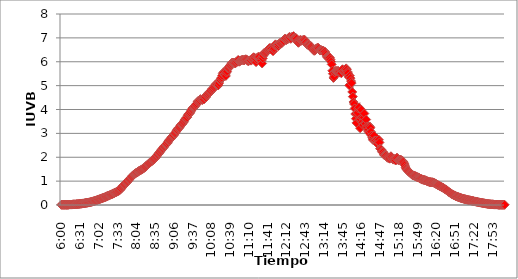
| Category | IUV (01/5) |
|---|---|
| 0.25 | 0.009 |
| 0.25069444444444444 | 0.009 |
| 0.2513888888888889 | 0.009 |
| 0.2520833333333333 | 0.009 |
| 0.25277777777777777 | 0.009 |
| 0.2534722222222222 | 0.009 |
| 0.25416666666666665 | 0.009 |
| 0.2548611111111111 | 0.009 |
| 0.2555555555555556 | 0.009 |
| 0.25625000000000003 | 0.009 |
| 0.2569444444444445 | 0.009 |
| 0.2576388888888889 | 0.009 |
| 0.25833333333333336 | 0.009 |
| 0.2590277777777778 | 0.019 |
| 0.25972222222222224 | 0.019 |
| 0.2604166666666667 | 0.019 |
| 0.2611111111111111 | 0.019 |
| 0.26180555555555557 | 0.019 |
| 0.2625 | 0.019 |
| 0.26319444444444445 | 0.028 |
| 0.2638888888888889 | 0.028 |
| 0.26458333333333334 | 0.028 |
| 0.2652777777777778 | 0.028 |
| 0.2659722222222222 | 0.028 |
| 0.26666666666666666 | 0.028 |
| 0.2673611111111111 | 0.037 |
| 0.26805555555555555 | 0.037 |
| 0.26875 | 0.037 |
| 0.26944444444444443 | 0.037 |
| 0.2701388888888889 | 0.047 |
| 0.2708333333333333 | 0.047 |
| 0.27152777777777776 | 0.047 |
| 0.2722222222222222 | 0.056 |
| 0.27291666666666664 | 0.056 |
| 0.2736111111111111 | 0.056 |
| 0.2743055555555555 | 0.065 |
| 0.27499999999999997 | 0.065 |
| 0.27569444444444446 | 0.065 |
| 0.27638888888888885 | 0.075 |
| 0.27708333333333335 | 0.075 |
| 0.2777777777777778 | 0.084 |
| 0.27847222222222223 | 0.084 |
| 0.2791666666666667 | 0.093 |
| 0.2798611111111111 | 0.093 |
| 0.28055555555555556 | 0.103 |
| 0.28125 | 0.103 |
| 0.28194444444444444 | 0.112 |
| 0.2826388888888889 | 0.112 |
| 0.2833333333333333 | 0.121 |
| 0.28402777777777777 | 0.13 |
| 0.2847222222222222 | 0.13 |
| 0.28541666666666665 | 0.14 |
| 0.28611111111111115 | 0.149 |
| 0.28680555555555554 | 0.158 |
| 0.28750000000000003 | 0.158 |
| 0.2881944444444445 | 0.168 |
| 0.2888888888888889 | 0.177 |
| 0.28958333333333336 | 0.186 |
| 0.2902777777777778 | 0.196 |
| 0.29097222222222224 | 0.205 |
| 0.2916666666666667 | 0.214 |
| 0.2923611111111111 | 0.224 |
| 0.29305555555555557 | 0.233 |
| 0.29375 | 0.242 |
| 0.29444444444444445 | 0.252 |
| 0.2951388888888889 | 0.261 |
| 0.29583333333333334 | 0.27 |
| 0.2965277777777778 | 0.28 |
| 0.2972222222222222 | 0.289 |
| 0.29791666666666666 | 0.298 |
| 0.2986111111111111 | 0.308 |
| 0.29930555555555555 | 0.317 |
| 0.3 | 0.326 |
| 0.30069444444444443 | 0.336 |
| 0.3013888888888889 | 0.345 |
| 0.3020833333333333 | 0.363 |
| 0.30277777777777776 | 0.373 |
| 0.3034722222222222 | 0.382 |
| 0.30416666666666664 | 0.391 |
| 0.3048611111111111 | 0.401 |
| 0.3055555555555555 | 0.41 |
| 0.30624999999999997 | 0.429 |
| 0.3069444444444444 | 0.438 |
| 0.3076388888888889 | 0.447 |
| 0.30833333333333335 | 0.457 |
| 0.3090277777777778 | 0.466 |
| 0.30972222222222223 | 0.485 |
| 0.3104166666666667 | 0.494 |
| 0.3111111111111111 | 0.503 |
| 0.31180555555555556 | 0.522 |
| 0.3125 | 0.531 |
| 0.31319444444444444 | 0.541 |
| 0.3138888888888889 | 0.559 |
| 0.3145833333333333 | 0.569 |
| 0.31527777777777777 | 0.587 |
| 0.3159722222222222 | 0.596 |
| 0.31666666666666665 | 0.615 |
| 0.31736111111111115 | 0.634 |
| 0.31805555555555554 | 0.662 |
| 0.31875000000000003 | 0.69 |
| 0.3194444444444445 | 0.736 |
| 0.3201388888888889 | 0.774 |
| 0.32083333333333336 | 0.802 |
| 0.3215277777777778 | 0.82 |
| 0.32222222222222224 | 0.848 |
| 0.3229166666666667 | 0.876 |
| 0.3236111111111111 | 0.904 |
| 0.32430555555555557 | 0.932 |
| 0.325 | 0.951 |
| 0.32569444444444445 | 0.979 |
| 0.3263888888888889 | 1.007 |
| 0.32708333333333334 | 1.035 |
| 0.3277777777777778 | 1.062 |
| 0.3284722222222222 | 1.09 |
| 0.32916666666666666 | 1.118 |
| 0.3298611111111111 | 1.146 |
| 0.33055555555555555 | 1.174 |
| 0.33125 | 1.202 |
| 0.33194444444444443 | 1.23 |
| 0.3326388888888889 | 1.249 |
| 0.3333333333333333 | 1.277 |
| 0.3340277777777778 | 1.295 |
| 0.3347222222222222 | 1.314 |
| 0.3354166666666667 | 1.333 |
| 0.3361111111111111 | 1.351 |
| 0.3368055555555556 | 1.361 |
| 0.33749999999999997 | 1.37 |
| 0.33819444444444446 | 1.398 |
| 0.33888888888888885 | 1.417 |
| 0.33958333333333335 | 1.435 |
| 0.34027777777777773 | 1.445 |
| 0.34097222222222223 | 1.454 |
| 0.3416666666666666 | 1.473 |
| 0.3423611111111111 | 1.491 |
| 0.3430555555555555 | 1.501 |
| 0.34375 | 1.519 |
| 0.3444444444444445 | 1.538 |
| 0.3451388888888889 | 1.556 |
| 0.3458333333333334 | 1.575 |
| 0.34652777777777777 | 1.603 |
| 0.34722222222222227 | 1.631 |
| 0.34791666666666665 | 1.65 |
| 0.34861111111111115 | 1.668 |
| 0.34930555555555554 | 1.696 |
| 0.35000000000000003 | 1.715 |
| 0.3506944444444444 | 1.743 |
| 0.3513888888888889 | 1.771 |
| 0.3520833333333333 | 1.789 |
| 0.3527777777777778 | 1.808 |
| 0.3534722222222222 | 1.827 |
| 0.3541666666666667 | 1.845 |
| 0.3548611111111111 | 1.873 |
| 0.35555555555555557 | 1.892 |
| 0.35625 | 1.92 |
| 0.35694444444444445 | 1.939 |
| 0.3576388888888889 | 1.967 |
| 0.35833333333333334 | 1.994 |
| 0.3590277777777778 | 2.032 |
| 0.3597222222222222 | 2.06 |
| 0.36041666666666666 | 2.097 |
| 0.3611111111111111 | 2.125 |
| 0.36180555555555555 | 2.162 |
| 0.3625 | 2.19 |
| 0.36319444444444443 | 2.218 |
| 0.3638888888888889 | 2.255 |
| 0.3645833333333333 | 2.293 |
| 0.3652777777777778 | 2.321 |
| 0.3659722222222222 | 2.349 |
| 0.3666666666666667 | 2.377 |
| 0.3673611111111111 | 2.414 |
| 0.3680555555555556 | 2.442 |
| 0.36874999999999997 | 2.479 |
| 0.36944444444444446 | 2.507 |
| 0.37013888888888885 | 2.535 |
| 0.37083333333333335 | 2.554 |
| 0.37152777777777773 | 2.582 |
| 0.37222222222222223 | 2.628 |
| 0.3729166666666666 | 2.675 |
| 0.3736111111111111 | 2.703 |
| 0.3743055555555555 | 2.731 |
| 0.375 | 2.759 |
| 0.3756944444444445 | 2.777 |
| 0.3763888888888889 | 2.824 |
| 0.3770833333333334 | 2.852 |
| 0.37777777777777777 | 2.88 |
| 0.37847222222222227 | 2.908 |
| 0.37916666666666665 | 2.926 |
| 0.37986111111111115 | 2.982 |
| 0.38055555555555554 | 2.992 |
| 0.38125000000000003 | 3.029 |
| 0.3819444444444444 | 3.094 |
| 0.3826388888888889 | 3.132 |
| 0.3833333333333333 | 3.15 |
| 0.3840277777777778 | 3.197 |
| 0.3847222222222222 | 3.234 |
| 0.3854166666666667 | 3.234 |
| 0.3861111111111111 | 3.271 |
| 0.38680555555555557 | 3.327 |
| 0.3875 | 3.374 |
| 0.38819444444444445 | 3.383 |
| 0.3888888888888889 | 3.402 |
| 0.38958333333333334 | 3.439 |
| 0.3902777777777778 | 3.467 |
| 0.3909722222222222 | 3.514 |
| 0.39166666666666666 | 3.56 |
| 0.3923611111111111 | 3.598 |
| 0.39305555555555555 | 3.625 |
| 0.39375 | 3.663 |
| 0.39444444444444443 | 3.672 |
| 0.3951388888888889 | 3.756 |
| 0.3958333333333333 | 3.803 |
| 0.3965277777777778 | 3.831 |
| 0.3972222222222222 | 3.831 |
| 0.3979166666666667 | 3.868 |
| 0.3986111111111111 | 3.924 |
| 0.3993055555555556 | 3.97 |
| 0.39999999999999997 | 4.008 |
| 0.40069444444444446 | 4.045 |
| 0.40138888888888885 | 4.082 |
| 0.40208333333333335 | 4.101 |
| 0.40277777777777773 | 4.11 |
| 0.40347222222222223 | 4.138 |
| 0.4041666666666666 | 4.175 |
| 0.4048611111111111 | 4.213 |
| 0.4055555555555555 | 4.25 |
| 0.40625 | 4.315 |
| 0.4069444444444445 | 4.352 |
| 0.4076388888888889 | 4.362 |
| 0.4083333333333334 | 4.352 |
| 0.40902777777777777 | 4.39 |
| 0.40972222222222227 | 4.436 |
| 0.41041666666666665 | 4.418 |
| 0.41111111111111115 | 4.418 |
| 0.41180555555555554 | 4.39 |
| 0.41250000000000003 | 4.418 |
| 0.4131944444444444 | 4.427 |
| 0.4138888888888889 | 4.427 |
| 0.4145833333333333 | 4.502 |
| 0.4152777777777778 | 4.548 |
| 0.4159722222222222 | 4.511 |
| 0.4166666666666667 | 4.585 |
| 0.4173611111111111 | 4.604 |
| 0.41805555555555557 | 4.632 |
| 0.41875 | 4.688 |
| 0.41944444444444445 | 4.669 |
| 0.4201388888888889 | 4.716 |
| 0.42083333333333334 | 4.735 |
| 0.4215277777777778 | 4.763 |
| 0.4222222222222222 | 4.8 |
| 0.42291666666666666 | 4.856 |
| 0.4236111111111111 | 4.837 |
| 0.42430555555555555 | 4.884 |
| 0.425 | 4.93 |
| 0.42569444444444443 | 4.921 |
| 0.4263888888888889 | 4.986 |
| 0.4270833333333333 | 5.051 |
| 0.4277777777777778 | 5.042 |
| 0.4284722222222222 | 5.033 |
| 0.4291666666666667 | 5.042 |
| 0.4298611111111111 | 5.005 |
| 0.4305555555555556 | 5.023 |
| 0.43124999999999997 | 5.107 |
| 0.43194444444444446 | 5.219 |
| 0.43263888888888885 | 5.238 |
| 0.43333333333333335 | 5.303 |
| 0.43402777777777773 | 5.34 |
| 0.43472222222222223 | 5.424 |
| 0.4354166666666666 | 5.508 |
| 0.4361111111111111 | 5.555 |
| 0.4368055555555555 | 5.545 |
| 0.4375 | 5.48 |
| 0.4381944444444445 | 5.471 |
| 0.4388888888888889 | 5.406 |
| 0.4395833333333334 | 5.545 |
| 0.44027777777777777 | 5.601 |
| 0.44097222222222227 | 5.722 |
| 0.44166666666666665 | 5.741 |
| 0.44236111111111115 | 5.741 |
| 0.44305555555555554 | 5.806 |
| 0.44375000000000003 | 5.844 |
| 0.4444444444444444 | 5.872 |
| 0.4451388888888889 | 5.909 |
| 0.4458333333333333 | 5.955 |
| 0.4465277777777778 | 5.955 |
| 0.4472222222222222 | 5.965 |
| 0.4479166666666667 | 5.955 |
| 0.4486111111111111 | 5.955 |
| 0.44930555555555557 | 5.937 |
| 0.45 | 5.937 |
| 0.45069444444444445 | 5.983 |
| 0.4513888888888889 | 6.011 |
| 0.45208333333333334 | 6.002 |
| 0.4527777777777778 | 6.067 |
| 0.4534722222222222 | 6.067 |
| 0.45416666666666666 | 6.002 |
| 0.4548611111111111 | 6.021 |
| 0.45555555555555555 | 6.039 |
| 0.45625 | 6.058 |
| 0.45694444444444443 | 6.067 |
| 0.4576388888888889 | 6.077 |
| 0.4583333333333333 | 6.077 |
| 0.4590277777777778 | 6.077 |
| 0.4597222222222222 | 6.058 |
| 0.4604166666666667 | 6.067 |
| 0.4611111111111111 | 6.095 |
| 0.4618055555555556 | 6.105 |
| 0.46249999999999997 | 6.095 |
| 0.46319444444444446 | 6.077 |
| 0.46388888888888885 | 6.049 |
| 0.46458333333333335 | 6.021 |
| 0.46527777777777773 | 6.039 |
| 0.46597222222222223 | 6.058 |
| 0.4666666666666666 | 6.049 |
| 0.4673611111111111 | 6.058 |
| 0.4680555555555555 | 6.049 |
| 0.46875 | 6.105 |
| 0.4694444444444445 | 6.123 |
| 0.4701388888888889 | 6.151 |
| 0.4708333333333334 | 6.188 |
| 0.47152777777777777 | 6.151 |
| 0.47222222222222227 | 6.161 |
| 0.47291666666666665 | 6.133 |
| 0.47361111111111115 | 5.983 |
| 0.47430555555555554 | 6.095 |
| 0.47500000000000003 | 6.17 |
| 0.4756944444444444 | 6.188 |
| 0.4763888888888889 | 6.207 |
| 0.4770833333333333 | 6.198 |
| 0.4777777777777778 | 6.086 |
| 0.4784722222222222 | 6.114 |
| 0.4791666666666667 | 6.058 |
| 0.4798611111111111 | 6.049 |
| 0.48055555555555557 | 5.928 |
| 0.48125 | 6.142 |
| 0.48194444444444445 | 6.254 |
| 0.4826388888888889 | 6.347 |
| 0.48333333333333334 | 6.384 |
| 0.4840277777777778 | 6.356 |
| 0.4847222222222222 | 6.375 |
| 0.48541666666666666 | 6.394 |
| 0.4861111111111111 | 6.449 |
| 0.48680555555555555 | 6.477 |
| 0.4875 | 6.487 |
| 0.48819444444444443 | 6.515 |
| 0.4888888888888889 | 6.561 |
| 0.4895833333333333 | 6.58 |
| 0.4902777777777778 | 6.524 |
| 0.4909722222222222 | 6.561 |
| 0.4916666666666667 | 6.552 |
| 0.4923611111111111 | 6.487 |
| 0.4930555555555556 | 6.44 |
| 0.49374999999999997 | 6.524 |
| 0.49444444444444446 | 6.571 |
| 0.49513888888888885 | 6.673 |
| 0.49583333333333335 | 6.729 |
| 0.49652777777777773 | 6.682 |
| 0.49722222222222223 | 6.682 |
| 0.4979166666666666 | 6.701 |
| 0.4986111111111111 | 6.71 |
| 0.4993055555555555 | 6.654 |
| 0.5 | 6.72 |
| 0.5006944444444444 | 6.785 |
| 0.5013888888888889 | 6.766 |
| 0.5020833333333333 | 6.757 |
| 0.5027777777777778 | 6.766 |
| 0.5034722222222222 | 6.822 |
| 0.5041666666666667 | 6.841 |
| 0.5048611111111111 | 6.878 |
| 0.5055555555555555 | 6.869 |
| 0.50625 | 6.953 |
| 0.5069444444444444 | 6.962 |
| 0.5076388888888889 | 6.953 |
| 0.5083333333333333 | 6.906 |
| 0.5090277777777777 | 6.934 |
| 0.5097222222222222 | 6.934 |
| 0.5104166666666666 | 6.971 |
| 0.5111111111111112 | 7.009 |
| 0.5118055555555555 | 7.037 |
| 0.5125000000000001 | 7.027 |
| 0.5131944444444444 | 6.962 |
| 0.513888888888889 | 6.971 |
| 0.5145833333333333 | 7.037 |
| 0.5152777777777778 | 7.046 |
| 0.5159722222222222 | 7.055 |
| 0.5166666666666667 | 7.074 |
| 0.517361111111111 | 7.009 |
| 0.5180555555555556 | 7.009 |
| 0.5187499999999999 | 6.981 |
| 0.5194444444444445 | 6.99 |
| 0.5201388888888888 | 6.962 |
| 0.5208333333333334 | 6.869 |
| 0.5215277777777778 | 6.822 |
| 0.5222222222222223 | 6.794 |
| 0.5229166666666667 | 6.832 |
| 0.5236111111111111 | 6.878 |
| 0.5243055555555556 | 6.915 |
| 0.525 | 6.897 |
| 0.5256944444444445 | 6.878 |
| 0.5263888888888889 | 6.897 |
| 0.5270833333333333 | 6.897 |
| 0.5277777777777778 | 6.906 |
| 0.5284722222222222 | 6.915 |
| 0.5291666666666667 | 6.925 |
| 0.5298611111111111 | 6.878 |
| 0.5305555555555556 | 6.822 |
| 0.53125 | 6.813 |
| 0.5319444444444444 | 6.738 |
| 0.5326388888888889 | 6.71 |
| 0.5333333333333333 | 6.71 |
| 0.5340277777777778 | 6.71 |
| 0.5347222222222222 | 6.682 |
| 0.5354166666666667 | 6.654 |
| 0.5361111111111111 | 6.654 |
| 0.5368055555555555 | 6.645 |
| 0.5375 | 6.608 |
| 0.5381944444444444 | 6.552 |
| 0.5388888888888889 | 6.505 |
| 0.5395833333333333 | 6.505 |
| 0.5402777777777777 | 6.459 |
| 0.5409722222222222 | 6.468 |
| 0.5416666666666666 | 6.505 |
| 0.5423611111111112 | 6.543 |
| 0.5430555555555555 | 6.552 |
| 0.5437500000000001 | 6.58 |
| 0.5444444444444444 | 6.58 |
| 0.545138888888889 | 6.58 |
| 0.5458333333333333 | 6.543 |
| 0.5465277777777778 | 6.487 |
| 0.5472222222222222 | 6.468 |
| 0.5479166666666667 | 6.477 |
| 0.548611111111111 | 6.487 |
| 0.5493055555555556 | 6.468 |
| 0.5499999999999999 | 6.468 |
| 0.5506944444444445 | 6.468 |
| 0.5513888888888888 | 6.431 |
| 0.5520833333333334 | 6.403 |
| 0.5527777777777778 | 6.421 |
| 0.5534722222222223 | 6.356 |
| 0.5541666666666667 | 6.291 |
| 0.5548611111111111 | 6.207 |
| 0.5555555555555556 | 6.198 |
| 0.55625 | 6.179 |
| 0.5569444444444445 | 6.133 |
| 0.5576388888888889 | 6.188 |
| 0.5583333333333333 | 6.17 |
| 0.5590277777777778 | 6.095 |
| 0.5597222222222222 | 6.002 |
| 0.5604166666666667 | 5.89 |
| 0.5611111111111111 | 5.62 |
| 0.5618055555555556 | 5.499 |
| 0.5625 | 5.322 |
| 0.5631944444444444 | 5.368 |
| 0.5638888888888889 | 5.555 |
| 0.5645833333333333 | 5.611 |
| 0.5652777777777778 | 5.601 |
| 0.5659722222222222 | 5.611 |
| 0.5666666666666667 | 5.601 |
| 0.5673611111111111 | 5.611 |
| 0.5680555555555555 | 5.611 |
| 0.56875 | 5.583 |
| 0.5694444444444444 | 5.545 |
| 0.5701388888888889 | 5.583 |
| 0.5708333333333333 | 5.545 |
| 0.5715277777777777 | 5.517 |
| 0.5722222222222222 | 5.657 |
| 0.5729166666666666 | 5.685 |
| 0.5736111111111112 | 5.592 |
| 0.5743055555555555 | 5.592 |
| 0.5750000000000001 | 5.629 |
| 0.5756944444444444 | 5.667 |
| 0.576388888888889 | 5.685 |
| 0.5770833333333333 | 5.722 |
| 0.5777777777777778 | 5.667 |
| 0.5784722222222222 | 5.583 |
| 0.5791666666666667 | 5.527 |
| 0.579861111111111 | 5.368 |
| 0.5805555555555556 | 5.014 |
| 0.5812499999999999 | 5.415 |
| 0.5819444444444445 | 5.312 |
| 0.5826388888888888 | 5.191 |
| 0.5833333333333334 | 5.107 |
| 0.5840277777777778 | 4.735 |
| 0.5847222222222223 | 4.539 |
| 0.5854166666666667 | 4.315 |
| 0.5861111111111111 | 4.231 |
| 0.5868055555555556 | 4.045 |
| 0.5875 | 3.812 |
| 0.5881944444444445 | 3.616 |
| 0.5888888888888889 | 3.439 |
| 0.5895833333333333 | 3.793 |
| 0.5902777777777778 | 3.858 |
| 0.5909722222222222 | 4.045 |
| 0.5916666666666667 | 4.091 |
| 0.5923611111111111 | 3.579 |
| 0.5930555555555556 | 3.215 |
| 0.59375 | 3.588 |
| 0.5944444444444444 | 3.989 |
| 0.5951388888888889 | 3.672 |
| 0.5958333333333333 | 3.467 |
| 0.5965277777777778 | 3.346 |
| 0.5972222222222222 | 3.663 |
| 0.5979166666666667 | 3.831 |
| 0.5986111111111111 | 3.43 |
| 0.5993055555555555 | 3.402 |
| 0.6 | 3.579 |
| 0.6006944444444444 | 3.29 |
| 0.6013888888888889 | 3.243 |
| 0.6020833333333333 | 3.104 |
| 0.6027777777777777 | 3.159 |
| 0.6034722222222222 | 3.02 |
| 0.6041666666666666 | 3.29 |
| 0.6048611111111112 | 3.234 |
| 0.6055555555555555 | 3.066 |
| 0.6062500000000001 | 2.908 |
| 0.6069444444444444 | 2.815 |
| 0.607638888888889 | 2.731 |
| 0.6083333333333333 | 2.843 |
| 0.6090277777777778 | 2.908 |
| 0.6097222222222222 | 2.703 |
| 0.6104166666666667 | 2.703 |
| 0.611111111111111 | 2.693 |
| 0.6118055555555556 | 2.638 |
| 0.6124999999999999 | 2.582 |
| 0.6131944444444445 | 2.554 |
| 0.6138888888888888 | 2.638 |
| 0.6145833333333334 | 2.731 |
| 0.6152777777777778 | 2.619 |
| 0.6159722222222223 | 2.367 |
| 0.6166666666666667 | 2.339 |
| 0.6173611111111111 | 2.321 |
| 0.6180555555555556 | 2.246 |
| 0.61875 | 2.209 |
| 0.6194444444444445 | 2.218 |
| 0.6201388888888889 | 2.134 |
| 0.6208333333333333 | 2.088 |
| 0.6215277777777778 | 2.106 |
| 0.6222222222222222 | 2.097 |
| 0.6229166666666667 | 2.078 |
| 0.6236111111111111 | 2.032 |
| 0.6243055555555556 | 1.985 |
| 0.625 | 1.976 |
| 0.6256944444444444 | 1.985 |
| 0.6263888888888889 | 1.957 |
| 0.6270833333333333 | 1.939 |
| 0.6277777777777778 | 1.994 |
| 0.6284722222222222 | 2.041 |
| 0.6291666666666667 | 2.004 |
| 0.6298611111111111 | 1.967 |
| 0.6305555555555555 | 1.92 |
| 0.63125 | 1.901 |
| 0.6319444444444444 | 1.929 |
| 0.6326388888888889 | 1.92 |
| 0.6333333333333333 | 1.883 |
| 0.6340277777777777 | 1.864 |
| 0.6347222222222222 | 1.939 |
| 0.6354166666666666 | 1.985 |
| 0.6361111111111112 | 1.948 |
| 0.6368055555555555 | 1.883 |
| 0.6375000000000001 | 1.883 |
| 0.6381944444444444 | 1.883 |
| 0.638888888888889 | 1.901 |
| 0.6395833333333333 | 1.892 |
| 0.6402777777777778 | 1.883 |
| 0.6409722222222222 | 1.855 |
| 0.6416666666666667 | 1.836 |
| 0.642361111111111 | 1.827 |
| 0.6430555555555556 | 1.789 |
| 0.6437499999999999 | 1.724 |
| 0.6444444444444445 | 1.668 |
| 0.6451388888888888 | 1.584 |
| 0.6458333333333334 | 1.528 |
| 0.6465277777777778 | 1.491 |
| 0.6472222222222223 | 1.463 |
| 0.6479166666666667 | 1.435 |
| 0.6486111111111111 | 1.407 |
| 0.6493055555555556 | 1.389 |
| 0.65 | 1.361 |
| 0.6506944444444445 | 1.342 |
| 0.6513888888888889 | 1.314 |
| 0.6520833333333333 | 1.286 |
| 0.6527777777777778 | 1.268 |
| 0.6534722222222222 | 1.249 |
| 0.6541666666666667 | 1.24 |
| 0.6548611111111111 | 1.23 |
| 0.6555555555555556 | 1.221 |
| 0.65625 | 1.212 |
| 0.6569444444444444 | 1.202 |
| 0.6576388888888889 | 1.184 |
| 0.6583333333333333 | 1.174 |
| 0.6590277777777778 | 1.165 |
| 0.6597222222222222 | 1.156 |
| 0.6604166666666667 | 1.146 |
| 0.6611111111111111 | 1.128 |
| 0.6618055555555555 | 1.109 |
| 0.6625 | 1.1 |
| 0.6631944444444444 | 1.09 |
| 0.6638888888888889 | 1.081 |
| 0.6645833333333333 | 1.062 |
| 0.6652777777777777 | 1.062 |
| 0.6659722222222222 | 1.053 |
| 0.6666666666666666 | 1.044 |
| 0.6673611111111111 | 1.044 |
| 0.6680555555555556 | 1.035 |
| 0.6687500000000001 | 1.025 |
| 0.6694444444444444 | 1.007 |
| 0.6701388888888888 | 0.997 |
| 0.6708333333333334 | 0.988 |
| 0.6715277777777778 | 0.979 |
| 0.6722222222222222 | 0.969 |
| 0.6729166666666666 | 0.96 |
| 0.6736111111111112 | 0.96 |
| 0.6743055555555556 | 0.96 |
| 0.6749999999999999 | 0.951 |
| 0.6756944444444444 | 0.951 |
| 0.6763888888888889 | 0.951 |
| 0.6770833333333334 | 0.941 |
| 0.6777777777777777 | 0.932 |
| 0.6784722222222223 | 0.913 |
| 0.6791666666666667 | 0.904 |
| 0.6798611111111111 | 0.885 |
| 0.6805555555555555 | 0.876 |
| 0.68125 | 0.857 |
| 0.6819444444444445 | 0.839 |
| 0.6826388888888889 | 0.829 |
| 0.6833333333333332 | 0.82 |
| 0.6840277777777778 | 0.802 |
| 0.6847222222222222 | 0.792 |
| 0.6854166666666667 | 0.774 |
| 0.686111111111111 | 0.764 |
| 0.6868055555555556 | 0.746 |
| 0.6875 | 0.736 |
| 0.6881944444444444 | 0.718 |
| 0.688888888888889 | 0.708 |
| 0.6895833333333333 | 0.69 |
| 0.6902777777777778 | 0.671 |
| 0.6909722222222222 | 0.652 |
| 0.6916666666666668 | 0.634 |
| 0.6923611111111111 | 0.624 |
| 0.6930555555555555 | 0.606 |
| 0.69375 | 0.578 |
| 0.6944444444444445 | 0.559 |
| 0.6951388888888889 | 0.541 |
| 0.6958333333333333 | 0.522 |
| 0.6965277777777777 | 0.503 |
| 0.6972222222222223 | 0.485 |
| 0.6979166666666666 | 0.466 |
| 0.6986111111111111 | 0.457 |
| 0.6993055555555556 | 0.438 |
| 0.7000000000000001 | 0.429 |
| 0.7006944444444444 | 0.41 |
| 0.7013888888888888 | 0.401 |
| 0.7020833333333334 | 0.391 |
| 0.7027777777777778 | 0.373 |
| 0.7034722222222222 | 0.363 |
| 0.7041666666666666 | 0.354 |
| 0.7048611111111112 | 0.345 |
| 0.7055555555555556 | 0.336 |
| 0.7062499999999999 | 0.326 |
| 0.7069444444444444 | 0.317 |
| 0.7076388888888889 | 0.308 |
| 0.7083333333333334 | 0.298 |
| 0.7090277777777777 | 0.289 |
| 0.7097222222222223 | 0.28 |
| 0.7104166666666667 | 0.27 |
| 0.7111111111111111 | 0.27 |
| 0.7118055555555555 | 0.261 |
| 0.7125 | 0.252 |
| 0.7131944444444445 | 0.242 |
| 0.7138888888888889 | 0.242 |
| 0.7145833333333332 | 0.233 |
| 0.7152777777777778 | 0.224 |
| 0.7159722222222222 | 0.224 |
| 0.7166666666666667 | 0.214 |
| 0.717361111111111 | 0.205 |
| 0.7180555555555556 | 0.205 |
| 0.71875 | 0.196 |
| 0.7194444444444444 | 0.196 |
| 0.720138888888889 | 0.186 |
| 0.7208333333333333 | 0.177 |
| 0.7215277777777778 | 0.177 |
| 0.7222222222222222 | 0.168 |
| 0.7229166666666668 | 0.168 |
| 0.7236111111111111 | 0.158 |
| 0.7243055555555555 | 0.149 |
| 0.725 | 0.149 |
| 0.7256944444444445 | 0.14 |
| 0.7263888888888889 | 0.14 |
| 0.7270833333333333 | 0.13 |
| 0.7277777777777777 | 0.13 |
| 0.7284722222222223 | 0.121 |
| 0.7291666666666666 | 0.112 |
| 0.7298611111111111 | 0.112 |
| 0.7305555555555556 | 0.103 |
| 0.7312500000000001 | 0.103 |
| 0.7319444444444444 | 0.093 |
| 0.7326388888888888 | 0.093 |
| 0.7333333333333334 | 0.084 |
| 0.7340277777777778 | 0.084 |
| 0.7347222222222222 | 0.075 |
| 0.7354166666666666 | 0.075 |
| 0.7361111111111112 | 0.065 |
| 0.7368055555555556 | 0.065 |
| 0.7374999999999999 | 0.056 |
| 0.7381944444444444 | 0.056 |
| 0.7388888888888889 | 0.047 |
| 0.7395833333333334 | 0.047 |
| 0.7402777777777777 | 0.047 |
| 0.7409722222222223 | 0.037 |
| 0.7416666666666667 | 0.037 |
| 0.7423611111111111 | 0.037 |
| 0.7430555555555555 | 0.028 |
| 0.74375 | 0.028 |
| 0.7444444444444445 | 0.028 |
| 0.7451388888888889 | 0.028 |
| 0.7458333333333332 | 0.028 |
| 0.7465277777777778 | 0.019 |
| 0.7472222222222222 | 0.019 |
| 0.7479166666666667 | 0.019 |
| 0.748611111111111 | 0.019 |
| 0.7493055555555556 | 0.019 |
| 0.75 | 0.019 |
| 0.7506944444444444 | 0.019 |
| 0.751388888888889 | 0.009 |
| 0.7520833333333333 | 0.009 |
| 0.7527777777777778 | 0.009 |
| 0.7534722222222222 | 0.009 |
| 0.7541666666666668 | 0.009 |
| 0.7548611111111111 | 0.009 |
| 0.7555555555555555 | 0.009 |
| 0.75625 | 0.009 |
| 0.7569444444444445 | 0.009 |
| 0.7576388888888889 | 0.009 |
| 0.7583333333333333 | 0.009 |
| 0.7590277777777777 | 0.009 |